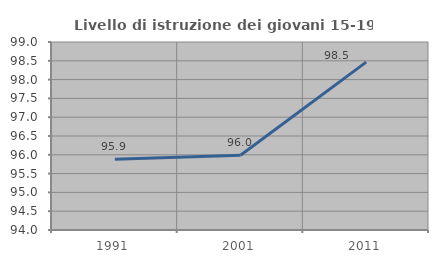
| Category | Livello di istruzione dei giovani 15-19 anni |
|---|---|
| 1991.0 | 95.881 |
| 2001.0 | 95.989 |
| 2011.0 | 98.465 |